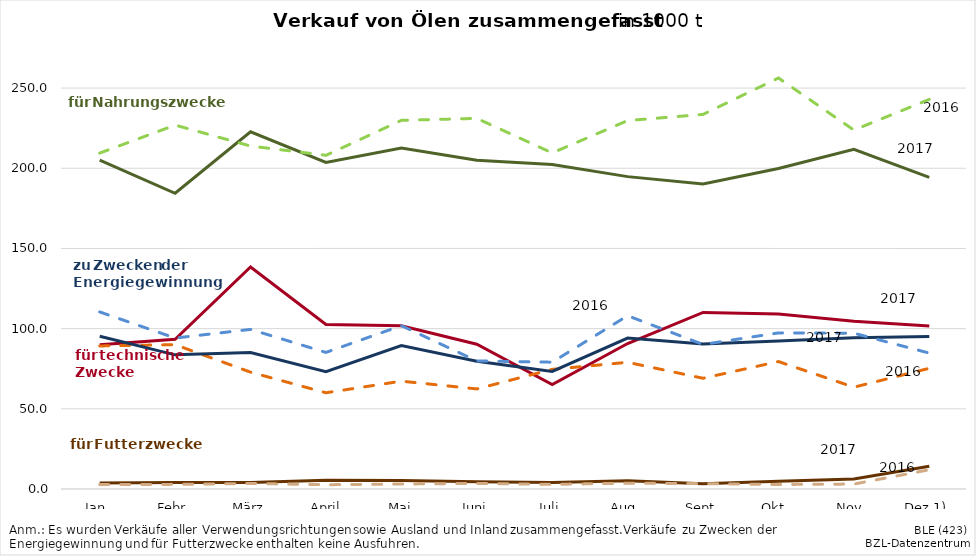
| Category | Series 0 | Series 1 | Series 2 | Series 3 | Series 4 | Series 5 | Series 6 | Series 7 |
|---|---|---|---|---|---|---|---|---|
| Jan. | 205.137 | 209.468 | 3.698 | 2.795 | 89.962 | 89.2 | 95.257 | 110.419 |
|  Febr. | 184.402 | 226.927 | 4.123 | 2.889 | 93.309 | 90 | 83.662 | 94.13 |
| März | 222.776 | 213.873 | 4.128 | 3.448 | 138.47 | 72.86 | 85.046 | 99.524 |
|  April | 203.693 | 208.087 | 5.405 | 2.674 | 102.542 | 60.011 | 73.14 | 85.167 |
|  Mai | 212.672 | 229.874 | 5.244 | 3.115 | 101.773 | 67.242 | 89.401 | 101.866 |
| Juni | 205.073 | 231.112 | 4.511 | 3.495 | 90.244 | 62.41 | 79.717 | 79.863 |
| Juli | 202.293 | 209.561 | 4.03 | 2.872 | 65.175 | 74.594 | 73.312 | 79.076 |
| Aug. | 194.789 | 229.747 | 5.084 | 3.634 | 90.719 | 79.02 | 94.101 | 108.055 |
|  Sept. | 190.164 | 233.586 | 3.286 | 3.367 | 110.131 | 69.057 | 90.405 | 90.134 |
| Okt. | 199.902 | 256.304 | 4.831 | 2.821 | 109.195 | 79.476 | 92.361 | 97.337 |
| Nov. | 211.841 | 223.821 | 6.273 | 3.082 | 104.624 | 63.491 | 94.263 | 97.163 |
| Dez 1) | 194.362 | 242.927 | 14.188 | 11.997 | 101.669 | 75.259 | 95.101 | 84.752 |